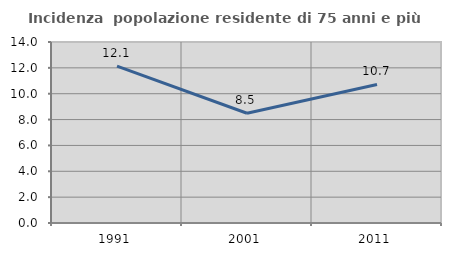
| Category | Incidenza  popolazione residente di 75 anni e più |
|---|---|
| 1991.0 | 12.137 |
| 2001.0 | 8.489 |
| 2011.0 | 10.714 |